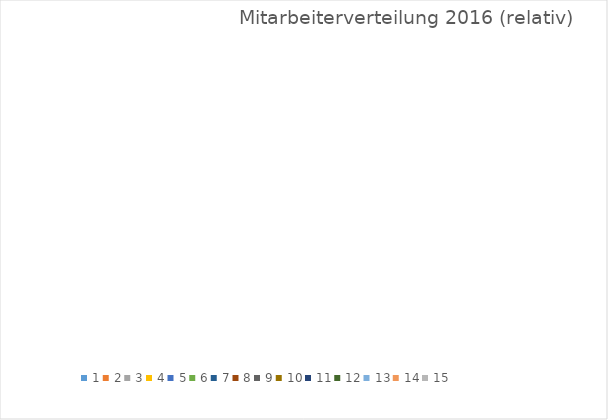
| Category | 2016 |
|---|---|
| 0 | 0 |
| 1 | 0 |
| 2 | 0 |
| 3 | 0 |
| 4 | 0 |
| 5 | 0 |
| 6 | 0 |
| 7 | 0 |
| 8 | 0 |
| 9 | 0 |
| 10 | 0 |
| 11 | 0 |
| 12 | 0 |
| 13 | 0 |
| 14 | 0 |